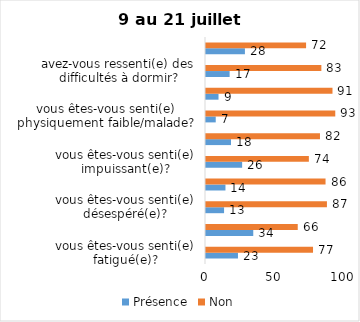
| Category | Présence | Non |
|---|---|---|
| vous êtes-vous senti(e) fatigué(e)? | 23 | 77 |
| vous êtes-vous senti(e) déçu(e) par certaines personnes? | 34 | 66 |
| vous êtes-vous senti(e) désespéré(e)? | 13 | 87 |
| vous êtes-vous senti(e) piégé(e)? | 14 | 86 |
| vous êtes-vous senti(e) impuissant(e)? | 26 | 74 |
| vous êtes-vous senti(e) déprimé(e)? | 18 | 82 |
| vous êtes-vous senti(e) physiquement faible/malade? | 7 | 93 |
| vous êtes-vous senti(e) inutile / “moins que rien”? | 9 | 91 |
| avez-vous ressenti(e) des difficultés à dormir? | 17 | 83 |
| pouvez-vous dire “J’en ai assez” / “Ça suffit”? | 28 | 72 |